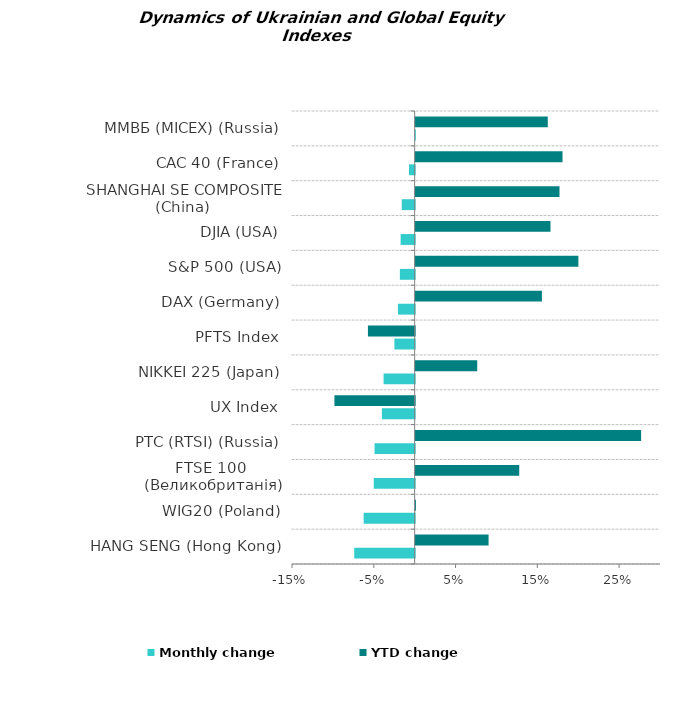
| Category | Monthly change | YTD change |
|---|---|---|
| HANG SENG (Hong Kong) | -0.074 | 0.089 |
| WIG20 (Poland) | -0.062 | 0 |
| FTSE 100  (Великобританія) | -0.05 | 0.127 |
| РТС (RTSI) (Russia) | -0.049 | 0.276 |
| UX Index | -0.04 | -0.098 |
| NIKKEI 225 (Japan) | -0.038 | 0.075 |
| PFTS Index | -0.025 | -0.057 |
| DAX (Germany) | -0.02 | 0.154 |
| S&P 500 (USA) | -0.018 | 0.199 |
| DJIA (USA) | -0.017 | 0.165 |
| SHANGHAI SE COMPOSITE (China) | -0.016 | 0.176 |
| CAC 40 (France) | -0.007 | 0.18 |
| ММВБ (MICEX) (Russia) | 0 | 0.162 |